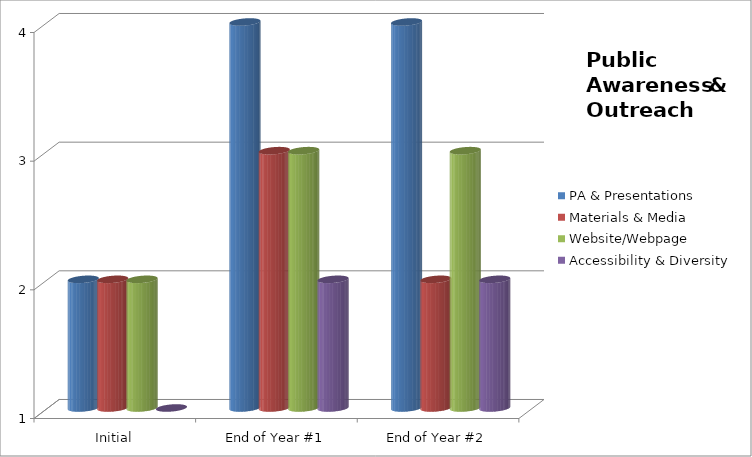
| Category | PA & Presentations  | Materials & Media  | Website/Webpage  | Accessibility & Diversity  |
|---|---|---|---|---|
| Initial | 2 | 2 | 2 | 1 |
| End of Year #1 | 4 | 3 | 3 | 2 |
| End of Year #2 | 4 | 2 | 3 | 2 |